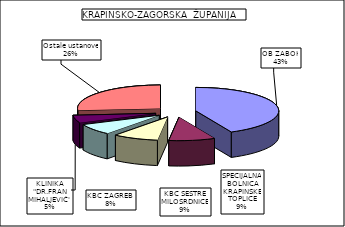
| Category | Series 0 |
|---|---|
| OB ZABOK | 42.948 |
| SPECIJALNA BOLNICA KRAPINSKE TOPLICE | 9.014 |
| KBC SESTRE MILOSRDNICE | 8.862 |
| KBC ZAGREB  | 7.657 |
| KLINIKA "DR.FRAN MIHALJEVIĆ" | 5.195 |
| Ostale ustanove | 26.324 |